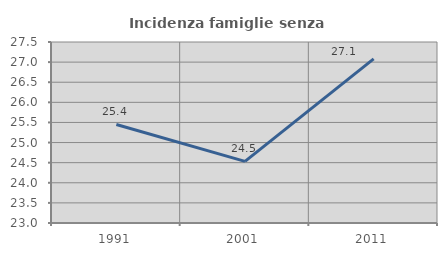
| Category | Incidenza famiglie senza nuclei |
|---|---|
| 1991.0 | 25.45 |
| 2001.0 | 24.532 |
| 2011.0 | 27.079 |